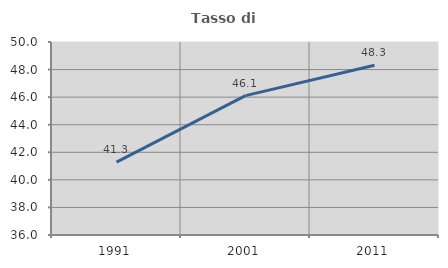
| Category | Tasso di occupazione   |
|---|---|
| 1991.0 | 41.287 |
| 2001.0 | 46.108 |
| 2011.0 | 48.31 |